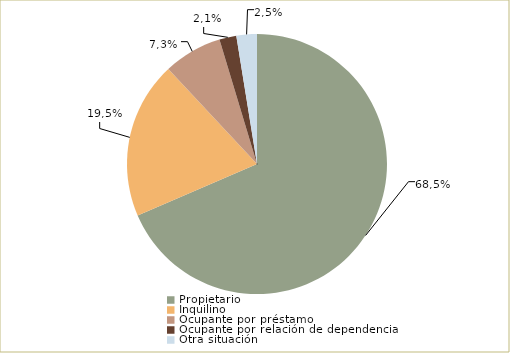
| Category | Series 0 |
|---|---|
| Propietario | 68.515 |
| Inquilino | 19.536 |
| Ocupante por préstamo | 7.287 |
| Ocupante por relación de dependencia | 2.115 |
| Otra situación | 2.547 |